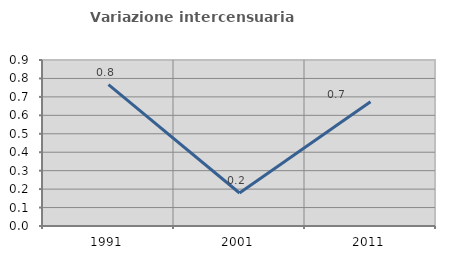
| Category | Variazione intercensuaria annua |
|---|---|
| 1991.0 | 0.766 |
| 2001.0 | 0.179 |
| 2011.0 | 0.674 |